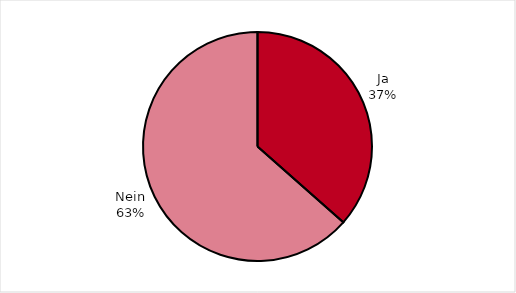
| Category | Series 0 |
|---|---|
| Ja | 36.515 |
| Nein | 63.485 |